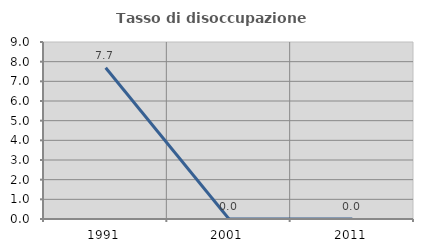
| Category | Tasso di disoccupazione giovanile  |
|---|---|
| 1991.0 | 7.692 |
| 2001.0 | 0 |
| 2011.0 | 0 |